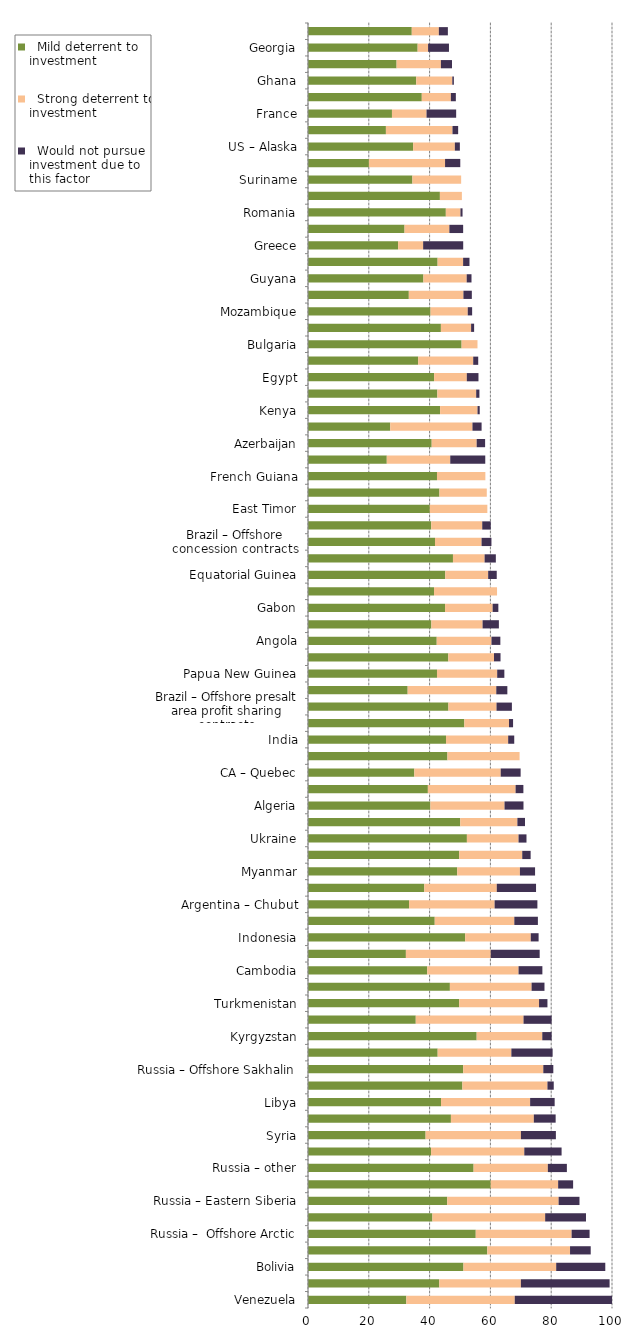
| Category |   Mild deterrent to investment |   Strong deterrent to investment |   Would not pursue investment due to this factor |
|---|---|---|---|
| Venezuela | 32.353 | 35.662 | 31.985 |
| Iran | 43.186 | 26.845 | 29.18 |
| Bolivia | 51.139 | 30.504 | 16.149 |
| Uzbekistan | 58.976 | 27.22 | 6.805 |
| Russia –  Offshore Arctic | 55.183 | 31.533 | 5.912 |
| Ecuador | 40.926 | 37.089 | 13.429 |
| Russia – Eastern Siberia | 45.798 | 36.639 | 6.87 |
| Kazakhstan | 60.11 | 22.172 | 4.927 |
| Russia – other | 54.475 | 24.42 | 6.261 |
| Argentina – Salta | 40.482 | 30.669 | 12.267 |
| Syria | 38.68 | 31.362 | 11.499 |
| Iraq | 47.012 | 27.274 | 7.177 |
| Libya | 43.755 | 29.312 | 8.071 |
| Bangladesh | 50.783 | 27.982 | 2.073 |
| Russia – Offshore Sakhalin | 51.053 | 26.35 | 3.294 |
| Argentina – Tierra del Fuego | 42.659 | 24.238 | 13.573 |
| Kyrgyzstan | 55.486 | 21.578 | 3.083 |
| South Sudan | 35.45 | 35.45 | 9.248 |
| Turkmenistan | 49.746 | 26.255 | 2.764 |
| Chad | 46.674 | 26.873 | 4.243 |
| Cambodia | 39.202 | 30.055 | 7.84 |
| Argentina – Santa Cruz | 32.202 | 27.908 | 16.101 |
| Indonesia | 51.693 | 21.588 | 2.575 |
| Argentina – Mendoza | 41.689 | 26.177 | 7.756 |
| Argentina – Chubut | 33.252 | 28.137 | 14.068 |
| Argentina – Neuquen | 38.252 | 23.845 | 12.916 |
| Myanmar | 49.084 | 20.63 | 4.98 |
| Democratic Republic of the Congo (Kinshasa) | 49.746 | 20.728 | 2.764 |
| Ukraine | 52.27 | 16.988 | 2.613 |
| Uganda | 50.092 | 18.784 | 2.505 |
| Algeria | 40.263 | 24.384 | 6.238 |
| Nigeria | 39.432 | 28.853 | 2.565 |
| CA – Quebec | 34.973 | 28.416 | 6.557 |
| Guatemala | 45.874 | 23.728 | 0 |
| India | 45.394 | 20.452 | 1.995 |
| China | 51.428 | 14.694 | 1.336 |
| Brazil – Offshore presalt area profit sharing contracts | 46.19 | 15.818 | 5.062 |
| Somaliland | 32.787 | 29.144 | 3.643 |
| Papua New Guinea | 42.431 | 19.801 | 2.357 |
| Republic of the Congo (Brazzaville) | 46.156 | 15.028 | 2.147 |
| Angola | 42.345 | 18.009 | 2.92 |
| Yemen | 40.584 | 16.846 | 5.36 |
| Gabon | 45.083 | 15.654 | 1.878 |
| Niger | 41.455 | 20.728 | 0 |
| Equatorial Guinea | 45.153 | 14.11 | 2.822 |
| Vietnam | 47.685 | 10.41 | 3.694 |
| Brazil – Offshore concession contracts | 41.775 | 15.318 | 3.249 |
| Brazil – Onshore concession contracts | 40.54 | 16.775 | 2.796 |
| East Timor | 40.074 | 18.924 | 0 |
| Timor Gap (JPDA) | 43.245 | 15.568 | 0 |
| French Guiana | 42.431 | 15.912 | 0 |
| US – New York | 25.916 | 20.877 | 11.518 |
| Azerbaijan | 40.69 | 14.796 | 2.774 |
| Ethiopia | 27.05 | 27.05 | 3.006 |
| Kenya | 43.453 | 12.312 | 0.724 |
| Madagascar | 42.556 | 12.767 | 1.064 |
| Egypt | 41.482 | 10.755 | 3.841 |
| Mauritania | 36.231 | 18.115 | 1.647 |
| Bulgaria | 50.527 | 5.227 | 0 |
| Tanzania | 43.717 | 9.936 | 0.994 |
| Mozambique | 40.313 | 12.238 | 1.44 |
| Greenland | 33.164 | 17.964 | 2.764 |
| Guyana | 37.964 | 14.237 | 1.582 |
| Cameroon | 42.636 | 8.387 | 2.097 |
| Greece | 29.643 | 8.234 | 13.175 |
| Kuwait | 31.756 | 14.744 | 4.537 |
| Romania | 45.34 | 4.809 | 0.687 |
| Ivory Coast | 43.388 | 7.231 | 0 |
| Suriname | 34.349 | 16.029 | 0 |
| US Offshore – Pacific | 20.037 | 25.046 | 5.009 |
| US – Alaska | 34.584 | 13.724 | 1.647 |
| US – California | 25.628 | 21.901 | 1.864 |
| France | 27.618 | 11.372 | 9.748 |
| Malaysia | 37.432 | 9.563 | 1.639 |
| Ghana | 35.602 | 11.867 | 0.516 |
| Lebanon | 29.144 | 14.572 | 3.643 |
| Georgia | 36.066 | 3.435 | 6.87 |
| Hungary | 34.137 | 8.905 | 2.968 |